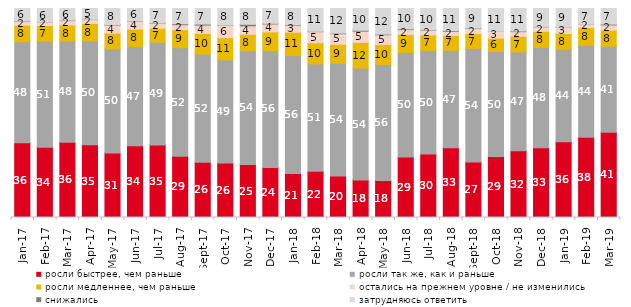
| Category | росли быстрее, чем раньше | росли так же, как и раньше | росли медленнее, чем раньше | остались на прежнем уровне / не изменились | снижались | затрудняюсь ответить |
|---|---|---|---|---|---|---|
| 2017-01-01 | 35.75 | 48.35 | 7.9 | 1.95 | 0.15 | 5.9 |
| 2017-02-01 | 33.65 | 50.75 | 7.45 | 1.8 | 0.1 | 6.25 |
| 2017-03-01 | 36 | 48.45 | 7.65 | 2.1 | 0.2 | 5.6 |
| 2017-04-01 | 34.85 | 49.65 | 8.35 | 1.85 | 0.1 | 5.2 |
| 2017-05-01 | 30.9 | 49.8 | 7.5 | 3.9 | 0.2 | 7.7 |
| 2017-06-01 | 34.3 | 47.4 | 8.4 | 3.95 | 0.15 | 5.8 |
| 2017-07-01 | 34.65 | 49.2 | 6.7 | 2.3 | 0.15 | 7 |
| 2017-08-01 | 29.3 | 51.9 | 8.65 | 2.4 | 0.45 | 7.3 |
| 2017-09-01 | 26.4 | 51.8 | 9.85 | 4 | 0.5 | 7.45 |
| 2017-10-01 | 26.1 | 49.3 | 10.65 | 5.8 | 0.15 | 8 |
| 2017-11-01 | 25.35 | 54.4 | 7.9 | 4.05 | 0.75 | 7.55 |
| 2017-12-01 | 23.95 | 55.95 | 8.9 | 3.8 | 0.3 | 7.1 |
| 2018-01-01 | 21.1 | 56.35 | 11.2 | 3.35 | 0.25 | 7.75 |
| 2018-02-01 | 22.1 | 51.4 | 10.1 | 5.3 | 0.2 | 10.9 |
| 2018-03-01 | 19.8 | 54 | 9.1 | 5.05 | 0.25 | 11.8 |
| 2018-04-01 | 17.95 | 53.55 | 12.3 | 5.35 | 0.45 | 10.4 |
| 2018-05-01 | 17.75 | 55.5 | 9.55 | 4.65 | 0.3 | 12.25 |
| 2018-06-01 | 28.9 | 50.1 | 8.6 | 2.3 | 0.35 | 9.75 |
| 2018-07-01 | 30.35 | 49.6 | 7.35 | 2.4 | 0.15 | 10.15 |
| 2018-08-01 | 33.35 | 46.65 | 7.05 | 2 | 0.35 | 10.6 |
| 2018-09-01 | 26.55 | 54.35 | 7.05 | 2.45 | 0.2 | 9.4 |
| 2018-10-01 | 29.2 | 50.2 | 6.45 | 3.15 | 0.05 | 10.95 |
| 2018-11-01 | 31.886 | 47.355 | 7.435 | 2.246 | 0.299 | 10.778 |
| 2018-12-01 | 33.4 | 48 | 7.7 | 2.1 | 0.05 | 8.75 |
| 2019-01-01 | 36.25 | 44.25 | 7.55 | 2.85 | 0.1 | 9 |
| 2019-02-01 | 38.35 | 44.05 | 8.45 | 1.85 | 0.05 | 7.25 |
| 2019-03-01 | 40.825 | 41.124 | 7.708 | 2.486 | 0.398 | 7.459 |